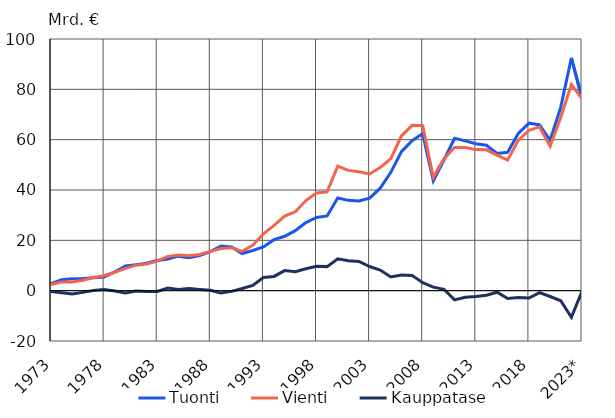
| Category | Tuonti | Vienti | Kauppatase |
|---|---|---|---|
| 1973 | 2.792 | 2.456 | -0.336 |
| 1974 | 4.317 | 3.479 | -0.838 |
| 1975 | 4.71 | 3.405 | -1.304 |
| 1976 | 4.803 | 4.121 | -0.681 |
| 1977 | 5.165 | 5.202 | 0.038 |
| 1978 | 5.439 | 5.921 | 0.482 |
| 1979 | 7.438 | 7.304 | -0.133 |
| 1980 | 9.797 | 8.879 | -0.918 |
| 1981 | 10.305 | 10.143 | -0.162 |
| 1982 | 10.89 | 10.6 | -0.29 |
| 1983 | 12.03 | 11.721 | -0.309 |
| 1984 | 12.561 | 13.607 | 1.047 |
| 1985 | 13.711 | 14.132 | 0.422 |
| 1986 | 13.052 | 13.889 | 0.837 |
| 1987 | 13.927 | 14.383 | 0.456 |
| 1988 | 15.493 | 15.625 | 0.132 |
| 1989 | 17.746 | 16.782 | -0.964 |
| 1990 | 17.327 | 17.042 | -0.285 |
| 1991 | 14.757 | 15.615 | 0.857 |
| 1992 | 15.969 | 18.074 | 2.105 |
| 1993 | 17.351 | 22.556 | 5.205 |
| 1994 | 20.274 | 25.928 | 5.654 |
| 1995 | 21.621 | 29.605 | 7.983 |
| 1996 | 23.836 | 31.339 | 7.504 |
| 1997 | 27.077 | 35.797 | 8.72 |
| 1998 | 29.066 | 38.779 | 9.713 |
| 1999 | 29.691 | 39.246 | 9.554 |
| 2000 | 36.837 | 49.484 | 12.647 |
| 2001 | 35.891 | 47.8 | 11.91 |
| 2002 | 35.611 | 47.245 | 11.634 |
| 2003 | 36.775 | 46.378 | 9.604 |
| 2004 | 40.73 | 48.917 | 8.187 |
| 2005 | 47.027 | 52.453 | 5.426 |
| 2006 | 55.253 | 61.489 | 6.237 |
| 2007 | 59.616 | 65.688 | 6.072 |
| 2008 | 62.402 | 65.58 | 3.178 |
| 2009 | 43.655 | 45.063 | 1.409 |
| 2010 | 51.899 | 52.439 | 0.539 |
| 2011 | 60.535 | 56.855 | -3.68 |
| 2012 | 59.517 | 56.878 | -2.639 |
| 2013 | 58.407 | 56.048 | -2.359 |
| 2014 | 57.769 | 55.973 | -1.796 |
| 2015 | 54.493 | 53.88 | -0.613 |
| 2016 | 55.003 | 51.878 | -3.125 |
| 2017 | 62.469 | 59.711 | -2.758 |
| 2018 | 66.585 | 63.682 | -2.903 |
| 2019 | 65.851 | 65.054 | -0.797 |
| 2020 | 59.768 | 57.44 | -2.328 |
| 2021 | 72.936 | 68.908 | -4.027 |
| 2022 | 92.469 | 81.885 | -10.585 |
| 2023* | 76.508 | 76.245 | -0.263 |